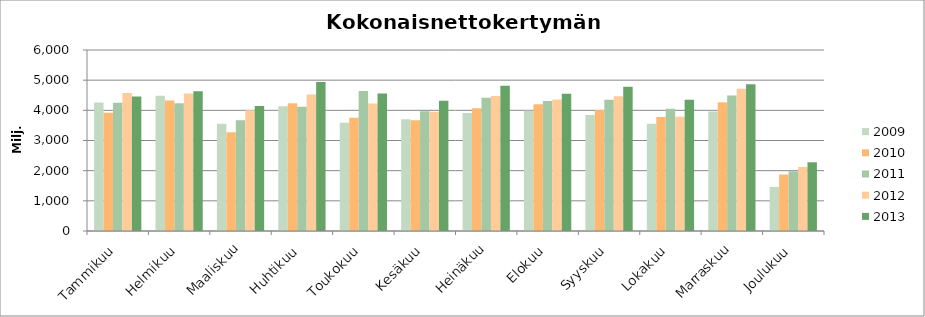
| Category | 2009 | 2010 | 2011 | 2012 | 2013 |
|---|---|---|---|---|---|
| Tammikuu | 4262.104 | 3920.596 | 4254.457 | 4574.273 | 4458.574 |
| Helmikuu | 4482.61 | 4324.273 | 4236.531 | 4556.683 | 4631.184 |
| Maaliskuu | 3551.222 | 3273.1 | 3667.911 | 4003.705 | 4141.995 |
| Huhtikuu | 4137.11 | 4235.283 | 4118.677 | 4521.853 | 4938.018 |
| Toukokuu | 3589.232 | 3758.246 | 4645.002 | 4229.781 | 4554.199 |
| Kesäkuu | 3701.617 | 3667.134 | 3966.073 | 3950.962 | 4320.908 |
| Heinäkuu | 3908.058 | 4070.751 | 4417.867 | 4473.488 | 4813.288 |
| Elokuu | 3983.999 | 4202.024 | 4310.334 | 4361.243 | 4548.338 |
| Syyskuu | 3843.197 | 4009.059 | 4353.55 | 4465.954 | 4780.078 |
| Lokakuu | 3558.554 | 3781.91 | 4052.329 | 3783.435 | 4353.533 |
| Marraskuu | 3964.456 | 4269.91 | 4491.275 | 4716.744 | 4864.184 |
| Joulukuu | 1461.632 | 1872.231 | 1978.993 | 2124.114 | 2278.078 |